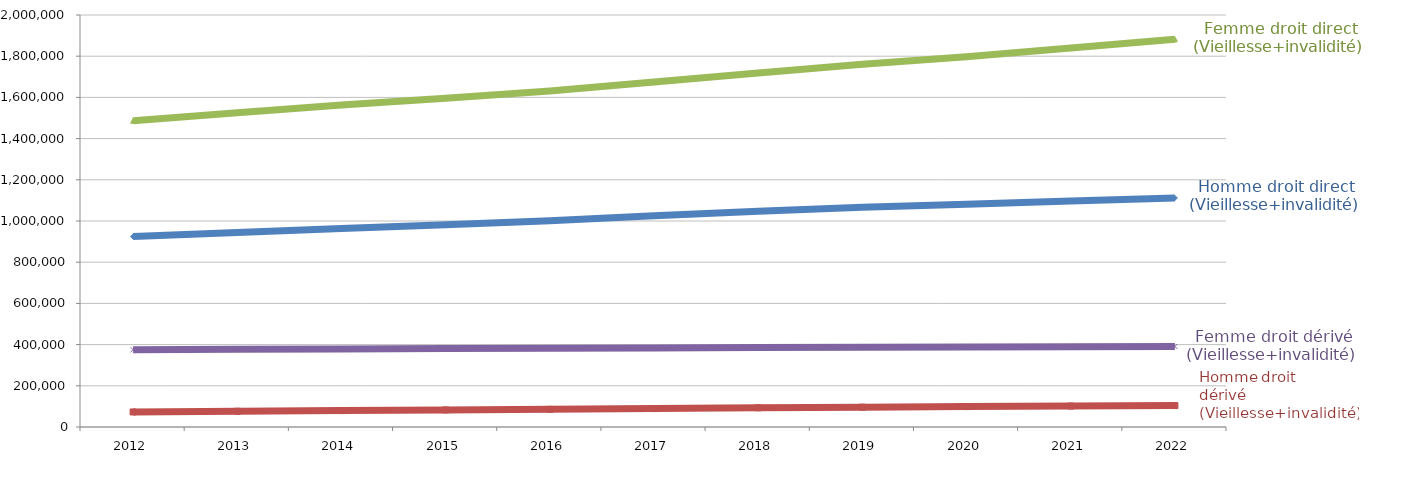
| Category | Homme droit direct (Vieillesse+invalidité) | Femme droit direct (Vieillesse+invalidité) | Femme droit dérivé (Vieillesse+invalidité) | Homme droit dérivé (Vieillesse+invalidité) |
|---|---|---|---|---|
| 2012.0 | 924280 | 1486319 | 375013 | 73017 |
| 2013.0 | 944579 | 1525461 | 376963 | 76396 |
| 2014.0 | 963675 | 1562572 | 378673 | 79640 |
| 2015.0 | 981204 | 1596159 | 380690 | 82868 |
| 2016.0 | 1000797 | 1631317 | 381714 | 85727 |
| 2017.0 | 1025294 | 1674238 | 383550 | 89368 |
| 2018.0 | 1046925 | 1718402 | 386350 | 93238 |
| 2019.0 | 1066844 | 1760645 | 387199 | 96183 |
| 2020.0 | 1081539 | 1797721 | 388185 | 98935 |
| 2021.0 | 1096513 | 1839368 | 389719 | 101729 |
| 2022.0 | 1111984 | 1882126 | 390795 | 103989 |